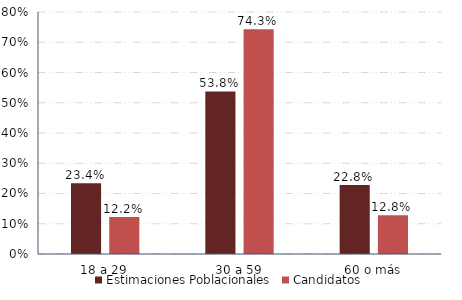
| Category | Estimaciones Poblacionales | Candidatos |
|---|---|---|
| 18 a 29 | 0.234 | 0.122 |
| 30 a 59 | 0.538 | 0.743 |
| 60 o más | 0.228 | 0.128 |